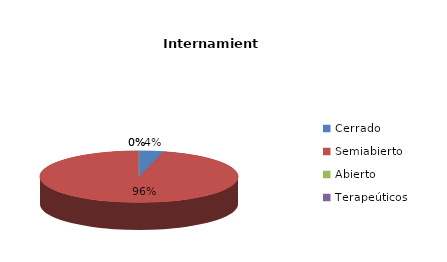
| Category | Series 0 |
|---|---|
| Cerrado | 2 |
| Semiabierto | 48 |
| Abierto | 0 |
| Terapeúticos | 0 |